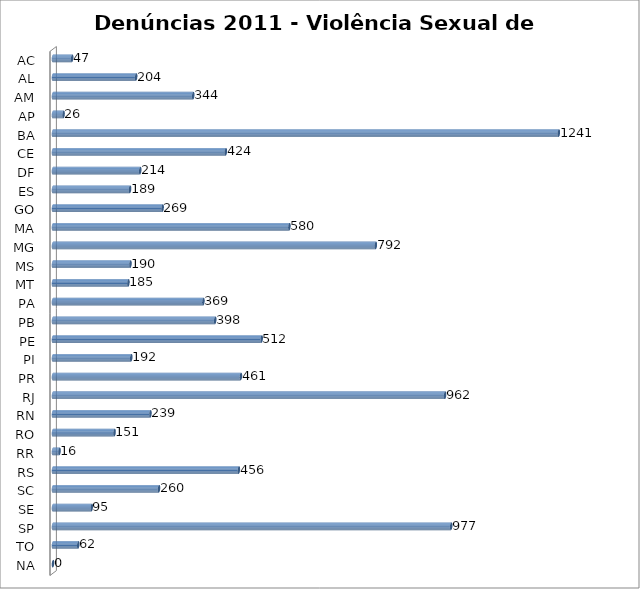
| Category | Series 0 |
|---|---|
| AC | 47 |
| AL | 204 |
| AM | 344 |
| AP | 26 |
| BA | 1241 |
| CE | 424 |
| DF | 214 |
| ES | 189 |
| GO | 269 |
| MA | 580 |
| MG | 792 |
| MS | 190 |
| MT | 185 |
| PA | 369 |
| PB | 398 |
| PE | 512 |
| PI | 192 |
| PR | 461 |
| RJ | 962 |
| RN | 239 |
| RO | 151 |
| RR | 16 |
| RS | 456 |
| SC | 260 |
| SE | 95 |
| SP | 977 |
| TO | 62 |
| NA | 0 |